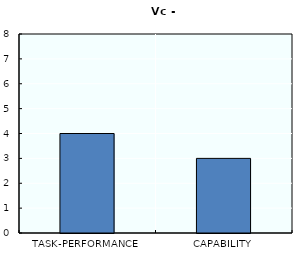
| Category | Series 0 |
|---|---|
| TASK-PERFORMANCE | 4 |
| CAPABILITY | 3 |